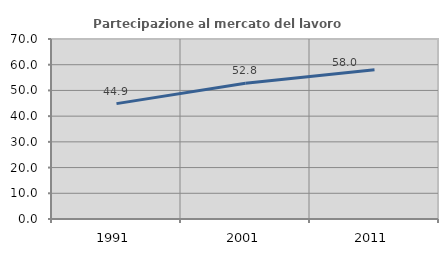
| Category | Partecipazione al mercato del lavoro  femminile |
|---|---|
| 1991.0 | 44.862 |
| 2001.0 | 52.768 |
| 2011.0 | 58.019 |